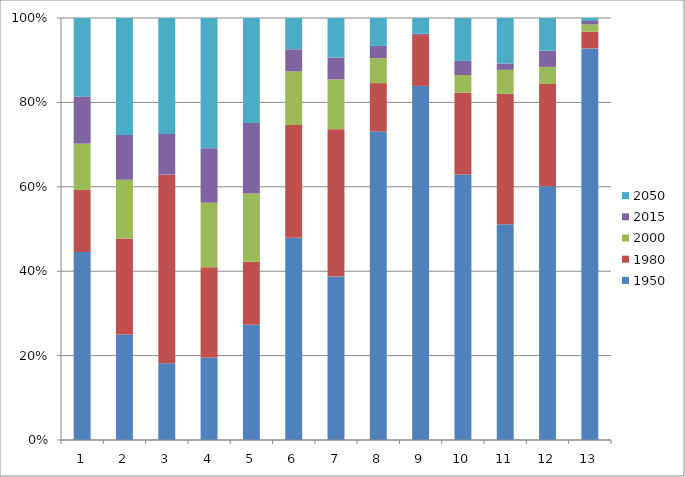
| Category | 1950 | 1980 | 2000 | 2015 | 2050 |
|---|---|---|---|---|---|
| 0 | 29.555 | 9.769 | 7.286 | 7.416 | 12.34 |
| 1 | 13.999 | 12.706 | 7.783 | 5.95 | 15.495 |
| 2 | 11.5 | 28.3 | 0 | 6.1 | 17.4 |
| 3 | 10.712 | 11.725 | 8.373 | 7.068 | 16.923 |
| 4 | 17.523 | 9.597 | 10.346 | 10.726 | 15.971 |
| 5 | 41.303 | 23.01 | 10.985 | 4.499 | 6.393 |
| 6 | 32.7 | 29.421 | 9.954 | 4.361 | 7.901 |
| 7 | 63.903 | 10.027 | 5.173 | 2.54 | 5.778 |
| 8 | 62.375 | 8.956 | 0 | 0.262 | 2.743 |
| 9 | 51.538 | 15.91 | 3.438 | 2.732 | 8.337 |
| 10 | 39.745 | 24.054 | 4.415 | 1.17 | 8.383 |
| 11 | 51.9 | 20.9 | 3.5 | 3.3 | 6.7 |
| 12 | 91.5 | 3.9 | 1.7 | 0.8 | 0.7 |